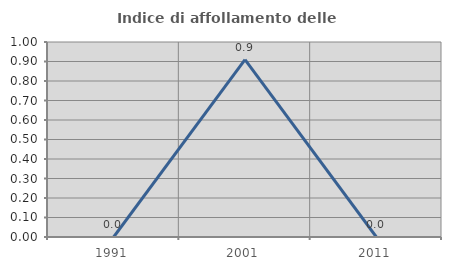
| Category | Indice di affollamento delle abitazioni  |
|---|---|
| 1991.0 | 0 |
| 2001.0 | 0.909 |
| 2011.0 | 0 |